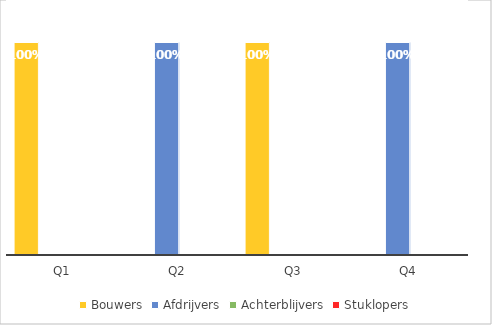
| Category | Bouwers | Afdrijvers | Achterblijvers | Stuklopers |
|---|---|---|---|---|
| Q1 | 1 | 0 | 0 | 0 |
| Q2 | 0 | 1 | 0 | 0 |
| Q3 | 1 | 0 | 0 | 0 |
| Q4 | 0 | 1 | 0 | 0 |